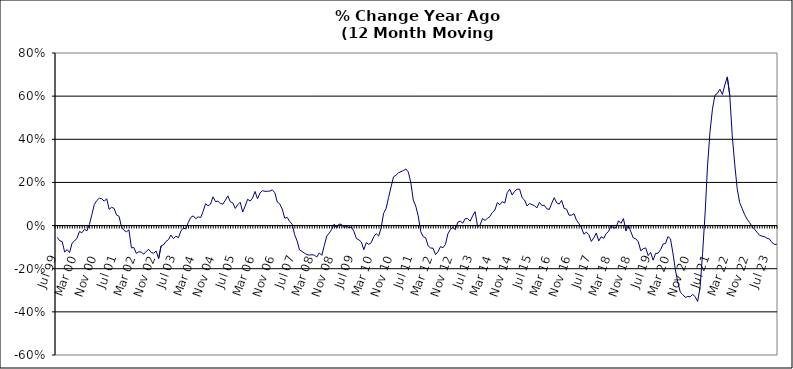
| Category | Series 0 |
|---|---|
| Jul 99 | -0.055 |
| Aug 99 | -0.07 |
| Sep 99 | -0.074 |
| Oct 99 | -0.123 |
| Nov 99 | -0.111 |
| Dec 99 | -0.125 |
| Jan 00 | -0.082 |
| Feb 00 | -0.071 |
| Mar 00 | -0.058 |
| Apr 00 | -0.027 |
| May 00 | -0.033 |
| Jun 00 | -0.017 |
| Jul 00 | -0.025 |
| Aug 00 | 0.005 |
| Sep 00 | 0.05 |
| Oct 00 | 0.098 |
| Nov 00 | 0.116 |
| Dec 00 | 0.127 |
| Jan 01 | 0.124 |
| Feb 01 | 0.113 |
| Mar 01 | 0.124 |
| Apr 01 | 0.075 |
| May 01 | 0.085 |
| Jun 01 | 0.08 |
| Jul 01 | 0.048 |
| Aug 01 | 0.043 |
| Sep 01 | -0.007 |
| Oct 01 | -0.022 |
| Nov 01 | -0.029 |
| Dec 01 | -0.02 |
| Jan 02 | -0.103 |
| Feb 02 | -0.102 |
| Mar 02 | -0.129 |
| Apr 02 | -0.121 |
| May 02 | -0.124 |
| Jun 02 | -0.132 |
| Jul 02 | -0.119 |
| Aug 02 | -0.11 |
| Sep 02 | -0.125 |
| Oct 02 | -0.128 |
| Nov 02 | -0.118 |
| Dec 02 | -0.153 |
| Jan 03 | -0.094 |
| Feb 03 | -0.09 |
| Mar 03 | -0.073 |
| Apr 03 | -0.065 |
| May 03 | -0.044 |
| Jun 03 | -0.06 |
| Jul 03 | -0.049 |
| Aug 03 | -0.056 |
| Sep 03 | -0.026 |
| Oct 03 | -0.012 |
| Nov 03 | -0.016 |
| Dec 03 | 0.014 |
| Jan 04 | 0.038 |
| Feb 04 | 0.045 |
| Mar 04 | 0.032 |
| Apr 04 | 0.041 |
| May 04 | 0.037 |
| Jun 04 | 0.066 |
| Jul 04 | 0.101 |
| Aug 04 | 0.092 |
| Sep 04 | 0.1 |
| Oct 04 | 0.133 |
| Nov 04 | 0.111 |
| Dec 04 | 0.113 |
| Jan 05 | 0.103 |
| Feb 05 | 0.1 |
| Mar 05 | 0.118 |
| Apr 05 | 0.138 |
| May 05 | 0.11 |
| Jun 05 | 0.106 |
| Jul 05 | 0.079 |
| Aug 05 | 0.097 |
| Sep 05 | 0.108 |
| Oct 05 | 0.063 |
| Nov 05 | 0.09 |
| Dec 05 | 0.122 |
| Jan 06 | 0.114 |
| Feb 06 | 0.127 |
| Mar 06 | 0.158 |
| Apr 06 | 0.124 |
| May 06 | 0.151 |
| Jun 06 | 0.162 |
| Jul 06 | 0.159 |
| Aug 06 | 0.159 |
| Sep 06 | 0.16 |
| Oct 06 | 0.166 |
| Nov 06 | 0.152 |
| Dec 06 | 0.109 |
| Jan 07 | 0.101 |
| Feb 07 | 0.076 |
| Mar 07 | 0.034 |
| Apr 07 | 0.038 |
| May 07 | 0.019 |
| Jun 07 | 0.007 |
| Jul 07 | -0.041 |
| Aug 07 | -0.071 |
| Sep 07 | -0.113 |
| Oct 07 | -0.12 |
| Nov 07 | -0.128 |
| Dec 07 | -0.135 |
| Jan 08 | -0.137 |
| Feb 08 | -0.135 |
| Mar 08 | -0.137 |
| Apr 08 | -0.145 |
| May 08 | -0.126 |
| Jun 08 | -0.138 |
| Jul 08 | -0.093 |
| Aug 08 | -0.049 |
| Sep-08 | -0.035 |
| Oct 08 | -0.018 |
| Nov 08 | 0.007 |
| Dec 08 | -0.011 |
| Jan 09 | 0.007 |
| Feb 09 | 0.005 |
| Mar 09 | -0.009 |
| Apr 09 | -0.003 |
| May 09 | -0.01 |
| Jun 09 | -0.007 |
| Jul 09 | -0.027 |
| Aug 09 | -0.06 |
| Sep 09 | -0.066 |
| Oct 09 | -0.076 |
| Nov 09 | -0.112 |
| Dec 09 | -0.079 |
| Jan 10 | -0.087 |
| Feb 10 | -0.079 |
| Mar 10 | -0.052 |
| Apr 10 | -0.037 |
| May 10 | -0.048 |
| Jun 10 | -0.01 |
| Jul 10 | 0.057 |
| Aug 10 | 0.08 |
| Sep 10 | 0.13 |
| Oct 10 | 0.179 |
| Nov 10 | 0.226 |
| Dec 10 | 0.233 |
| Jan 11 | 0.245 |
| Feb 11 | 0.25 |
| Mar 11 | 0.255 |
| Apr 11 | 0.262 |
| May 11 | 0.248 |
| Jun 11 | 0.199 |
| Jul 11 | 0.118 |
| Aug 11 | 0.09 |
| Sep 11 | 0.044 |
| Oct 11 | -0.028 |
| Nov 11 | -0.051 |
| Dec 11 | -0.056 |
| Jan 12 | -0.094 |
| Feb 12 | -0.104 |
| Mar 12 | -0.105 |
| Apr 12 | -0.134 |
| May 12 | -0.121 |
| Jun 12 | -0.098 |
| Jul 12 | -0.103 |
| Aug 12 | -0.087 |
| Sep 12 | -0.038 |
| Oct 12 | -0.018 |
| Nov 12 | -0.009 |
| Dec 12 | -0.019 |
| Jan 13 | 0.016 |
| Feb-13 | 0.02 |
| Mar-13 | 0.011 |
| Apr 13 | 0.032 |
| May 13 | 0.032 |
| Jun-13 | 0.021 |
| Jul 13 | 0.045 |
| Aug 13 | 0.065 |
| Sep 13 | -0.005 |
| Oct 13 | 0.002 |
| Nov 13 | 0.033 |
| Dec 13 | 0.024 |
| Jan 14 | 0.034 |
| Feb-14 | 0.042 |
| Mar 14 | 0.061 |
| Apr 14 | 0.072 |
| May 14 | 0.107 |
| Jun 14 | 0.097 |
| Jul-14 | 0.111 |
| Aug-14 | 0.105 |
| Sep 14 | 0.153 |
| Oct 14 | 0.169 |
| Nov 14 | 0.141 |
| Dec 14 | 0.159 |
| Jan 15 | 0.169 |
| Feb 15 | 0.169 |
| Mar 15 | 0.129 |
| Apr-15 | 0.118 |
| May 15 | 0.091 |
| Jun-15 | 0.102 |
| Jul 15 | 0.097 |
| Aug 15 | 0.092 |
| Sep 15 | 0.082 |
| Oct 15 | 0.108 |
| Nov 15 | 0.093 |
| Dec 15 | 0.094 |
| Jan 16 | 0.078 |
| Feb 16 | 0.075 |
| Mar 16 | 0.104 |
| Apr 16 | 0.129 |
| May 16 | 0.105 |
| Jun 16 | 0.1 |
| Jul 16 | 0.117 |
| Aug 16 | 0.08 |
| Sep 16 | 0.076 |
| Oct 16 | 0.048 |
| Nov 16 | 0.048 |
| Dec 16 | 0.055 |
| Jan 17 | 0.025 |
| Feb 17 | 0.009 |
| Mar 17 | -0.01 |
| Apr 17 | -0.04 |
| May 17 | -0.031 |
| Jun 17 | -0.042 |
| Jul 17 | -0.074 |
| Aug 17 | -0.057 |
| Sep 17 | -0.035 |
| Oct 17 | -0.071 |
| Nov 17 | -0.052 |
| Dec 17 | -0.059 |
| Jan 18 | -0.037 |
| Feb 18 | -0.027 |
| Mar 18 | 0 |
| Apr 18 | -0.012 |
| May 18 | -0.009 |
| Jun 18 | 0.022 |
| Jul 18 | 0.01 |
| Aug 18 | 0.033 |
| Sep 18 | -0.025 |
| Oct 18 | 0.002 |
| Nov 18 | -0.029 |
| Dec 18 | -0.058 |
| Jan 19 | -0.061 |
| Feb 19 | -0.075 |
| Mar 19 | -0.117 |
| Apr 19 | -0.107 |
| May 19 | -0.104 |
| Jun 19 | -0.139 |
| Jul 19 | -0.124 |
| Aug 19 | -0.16 |
| Sep 19 | -0.129 |
| Oct 19 | -0.128 |
| Nov 19 | -0.112 |
| Dec 19 | -0.085 |
| Jan 20 | -0.083 |
| Feb 20 | -0.051 |
| Mar 20 | -0.061 |
| Apr 20 | -0.127 |
| May 20 | -0.206 |
| Jun 20 | -0.264 |
| Jul 20 | -0.308 |
| Aug 20 | -0.32 |
| Sep 20 | -0.333 |
| Oct 20 | -0.329 |
| Nov 20 | -0.33 |
| Dec 20 | -0.319 |
| Jan 21 | -0.329 |
| Feb 21 | -0.352 |
| Mar 21 | -0.286 |
| Apr 21 | -0.129 |
| May 21 | 0.053 |
| Jun 21 | 0.276 |
| Jul 21 | 0.435 |
| Aug 21 | 0.541 |
| Sep 21 | 0.604 |
| Oct 21 | 0.613 |
| Nov 21 | 0.632 |
| Dec 21 | 0.608 |
| Jan 22 | 0.652 |
| Feb 22 | 0.689 |
| Mar 22 | 0.603 |
| Apr 22 | 0.416 |
| May 22 | 0.285 |
| Jun 22 | 0.171 |
| Jul 22 | 0.106 |
| Aug 22 | 0.079 |
| Sep 22 | 0.051 |
| Oct 22 | 0.03 |
| Nov 22 | 0.014 |
| Dec 22 | -0.004 |
| Jan 23 | -0.017 |
| Feb 23 | -0.031 |
| Mar 23 | -0.045 |
| Apr 23 | -0.049 |
| May 23 | -0.051 |
| Jun 23 | -0.058 |
| Jul 23 | -0.062 |
| Aug 23 | -0.078 |
| Sep 23 | -0.087 |
| Oct 23 | -0.087 |